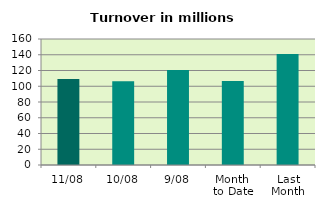
| Category | Series 0 |
|---|---|
| 11/08 | 109.202 |
| 10/08 | 106.444 |
| 9/08 | 120.59 |
| Month 
to Date | 106.76 |
| Last
Month | 140.832 |